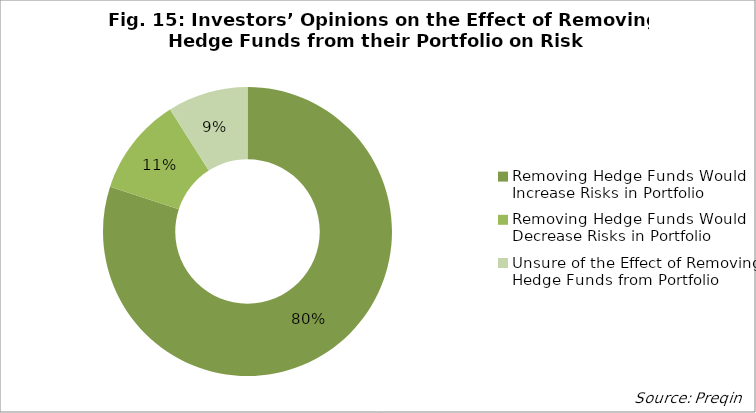
| Category | Series 0 |
|---|---|
| Removing Hedge Funds Would Increase Risks in Portfolio | 0.8 |
| Removing Hedge Funds Would Decrease Risks in Portfolio | 0.11 |
| Unsure of the Effect of Removing Hedge Funds from Portfolio | 0.09 |